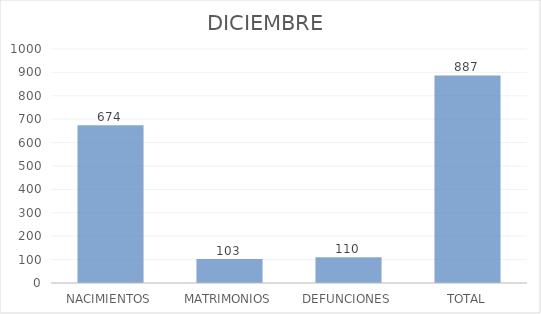
| Category | DICIEMBRE |
|---|---|
| NACIMIENTOS | 674 |
| MATRIMONIOS | 103 |
| DEFUNCIONES | 110 |
| TOTAL | 887 |